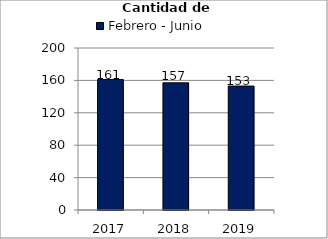
| Category | Febrero - Junio |
|---|---|
| 2017.0 | 161 |
| 2018.0 | 157 |
| 2019.0 | 153 |